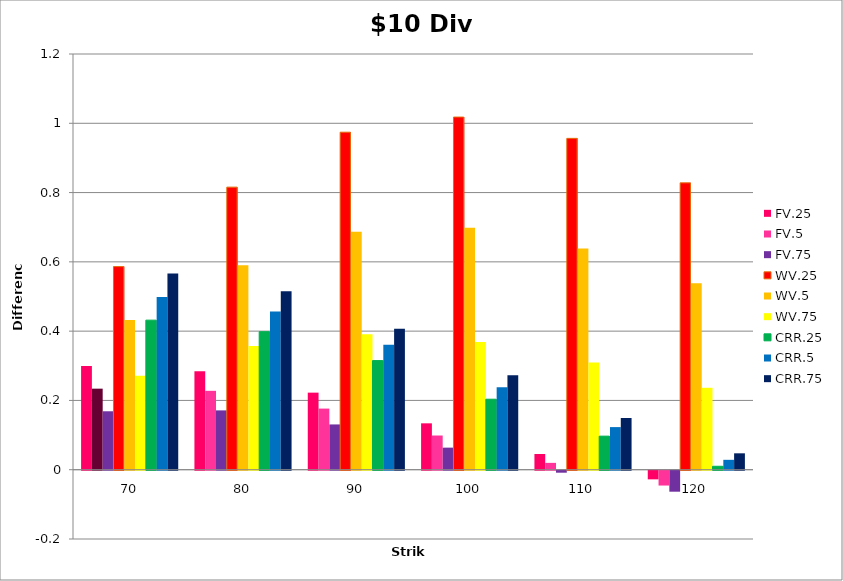
| Category | FV.25 | FV.5 | FV.75 | WV.25 | WV.5 | WV.75 | CRR.25 | CRR.5 | CRR.75 |
|---|---|---|---|---|---|---|---|---|---|
| 70.0 | 0.3 | 0.234 | 0.169 | 0.586 | 0.432 | 0.271 | 0.432 | 0.499 | 0.566 |
| 80.0 | 0.284 | 0.228 | 0.171 | 0.816 | 0.591 | 0.357 | 0.398 | 0.457 | 0.515 |
| 90.0 | 0.222 | 0.176 | 0.131 | 0.974 | 0.687 | 0.391 | 0.315 | 0.361 | 0.407 |
| 100.0 | 0.134 | 0.099 | 0.064 | 1.018 | 0.698 | 0.369 | 0.204 | 0.238 | 0.273 |
| 110.0 | 0.045 | 0.02 | -0.006 | 0.956 | 0.638 | 0.309 | 0.097 | 0.123 | 0.149 |
| 120.0 | -0.025 | -0.043 | -0.061 | 0.828 | 0.538 | 0.237 | 0.01 | 0.029 | 0.047 |